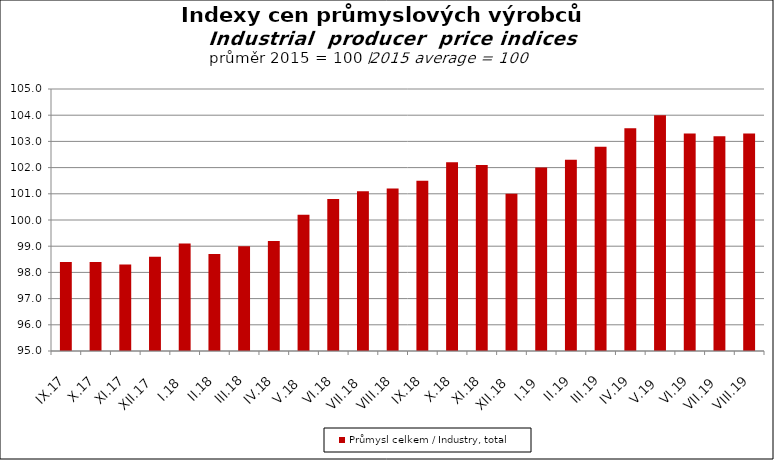
| Category | Průmysl celkem / Industry, total |
|---|---|
| IX.17 | 98.4 |
| X.17 | 98.4 |
| XI.17 | 98.3 |
| XII.17 | 98.6 |
| I.18 | 99.1 |
| II.18 | 98.7 |
| III.18 | 99 |
| IV.18 | 99.2 |
| V.18 | 100.2 |
| VI.18 | 100.8 |
| VII.18 | 101.1 |
| VIII.18 | 101.2 |
| IX.18 | 101.5 |
| X.18 | 102.2 |
| XI.18 | 102.1 |
| XII.18 | 101 |
| I.19 | 102 |
| II.19 | 102.3 |
| III.19 | 102.8 |
| IV.19 | 103.5 |
| V.19 | 104 |
| VI.19 | 103.3 |
| VII.19 | 103.2 |
| VIII.19 | 103.3 |